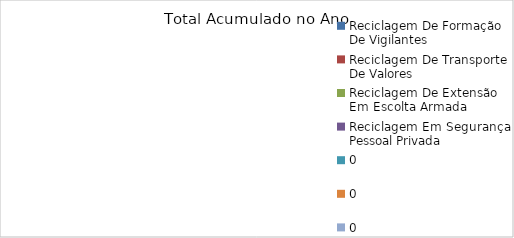
| Category | Total Acumulado no Ano |
|---|---|
| Reciclagem De Formação De Vigilantes | 0 |
| Reciclagem De Transporte De Valores | 0 |
| Reciclagem De Extensão Em Escolta Armada | 0 |
| Reciclagem Em Segurança Pessoal Privada | 0 |
| 0 | 0 |
| 0 | 0 |
| 0 | 0 |
| 0 | 0 |
| 0 | 0 |
| 0 | 0 |